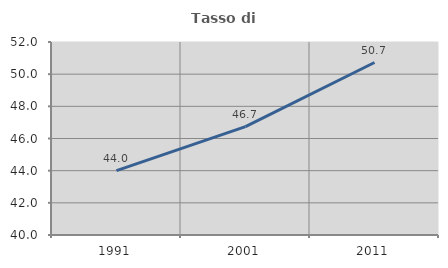
| Category | Tasso di occupazione   |
|---|---|
| 1991.0 | 44 |
| 2001.0 | 46.739 |
| 2011.0 | 50.725 |